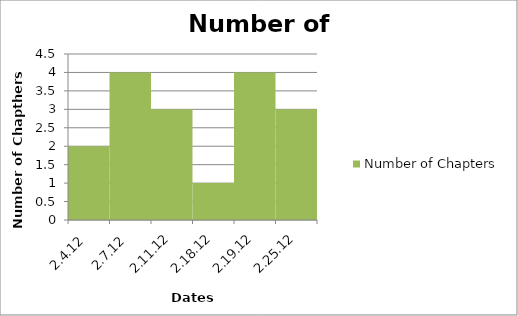
| Category | Number of Chapters |
|---|---|
| 2.4.12 | 2 |
| 2.7.12 | 4 |
| 2.11.12 | 3 |
| 2.18.12 | 1 |
| 2.19.12 | 4 |
| 2.25.12 | 3 |